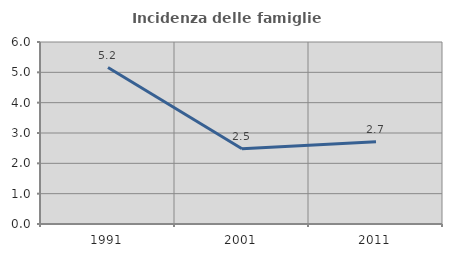
| Category | Incidenza delle famiglie numerose |
|---|---|
| 1991.0 | 5.157 |
| 2001.0 | 2.481 |
| 2011.0 | 2.708 |